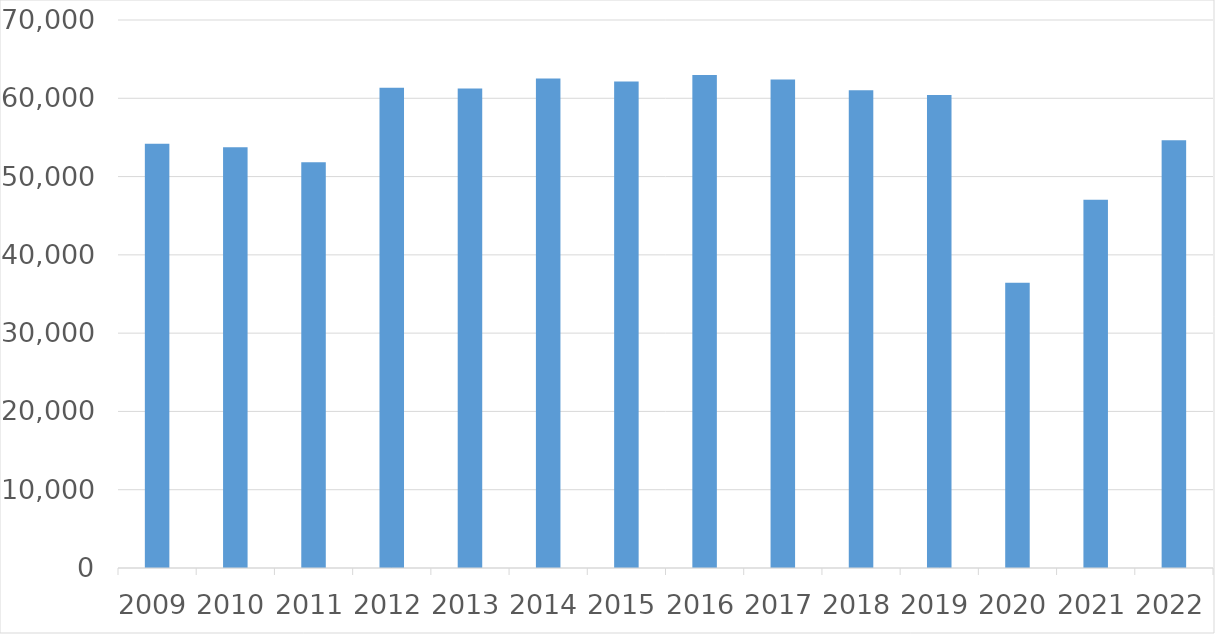
| Category | Series 0 |
|---|---|
| 2009 | 54194 |
| 2010 | 53747 |
| 2011 | 51832 |
| 2012 | 61331 |
| 2013 | 61259 |
| 2014 | 62521 |
| 2015 | 62157 |
| 2016 | 62969 |
| 2017 | 62402 |
| 2018 | 61014 |
| 2019 | 60424 |
| 2020 | 36442 |
| 2021 | 47032 |
| 2022 | 54641 |